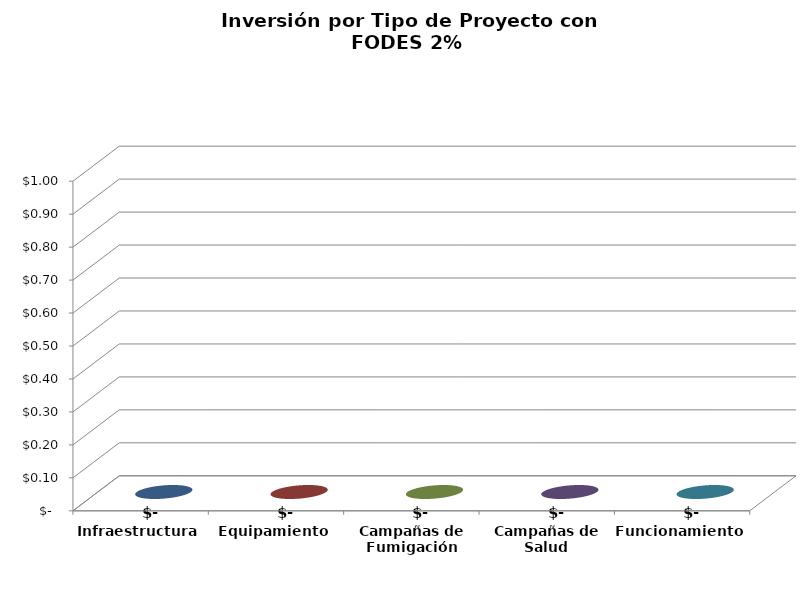
| Category | Series 0 |
|---|---|
| Infraestructura | 0 |
| Equipamiento | 0 |
| Campañas de Fumigación | 0 |
| Campañas de Salud | 0 |
| Funcionamiento | 0 |